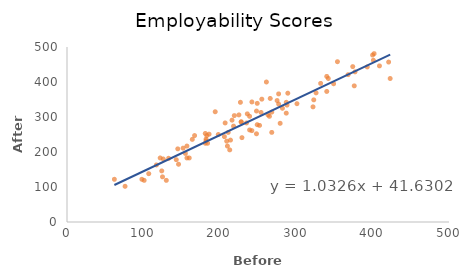
| Category | Employability (After) |
|---|---|
| 252.0 | 276 |
| 423.0 | 410 |
| 101.0 | 119 |
| 288.0 | 334 |
| 248.0 | 252 |
| 145.0 | 209 |
| 401.0 | 462 |
| 287.0 | 342 |
| 275.0 | 347 |
| 254.0 | 313 |
| 182.0 | 232 |
| 117.0 | 163 |
| 130.0 | 119 |
| 219.0 | 304 |
| 152.0 | 211 |
| 228.0 | 286 |
| 62.0 | 122 |
| 393.0 | 443 |
| 277.0 | 366 |
| 206.0 | 244 |
| 229.0 | 241 |
| 182.0 | 237 |
| 98.0 | 122 |
| 125.0 | 129 |
| 164.0 | 236 |
| 186.0 | 251 |
| 235.0 | 283 |
| 184.0 | 225 |
| 76.0 | 102 |
| 126.0 | 180 |
| 183.0 | 247 |
| 242.0 | 343 |
| 207.0 | 283 |
| 181.0 | 253 |
| 239.0 | 263 |
| 216.0 | 291 |
| 289.0 | 368 |
| 213.0 | 206 |
| 209.0 | 231 |
| 376.0 | 389 |
| 332.0 | 396 |
| 249.0 | 339 |
| 228.0 | 286 |
| 124.0 | 146 |
| 194.0 | 315 |
| 157.0 | 183 |
| 402.0 | 481 |
| 323.0 | 349 |
| 181.0 | 225 |
| 157.0 | 217 |
| 266.0 | 353 |
| 268.0 | 314 |
| 167.0 | 247 |
| 342.0 | 410 |
| 349.0 | 395 |
| 340.0 | 416 |
| 227.0 | 342 |
| 409.0 | 446 |
| 400.0 | 477 |
| 374.0 | 444 |
| 255.0 | 351 |
| 146.0 | 165 |
| 248.0 | 317 |
| 198.0 | 250 |
| 210.0 | 217 |
| 107.0 | 138 |
| 239.0 | 302 |
| 287.0 | 311 |
| 340.0 | 373 |
| 155.0 | 196 |
| 263.0 | 306 |
| 265.0 | 302 |
| 249.0 | 278 |
| 377.0 | 429 |
| 301.0 | 338 |
| 242.0 | 261 |
| 211.0 | 256 |
| 160.0 | 183 |
| 218.0 | 274 |
| 133.0 | 182 |
| 122.0 | 183 |
| 236.0 | 309 |
| 143.0 | 178 |
| 354.0 | 458 |
| 214.0 | 234 |
| 225.0 | 306 |
| 261.0 | 400 |
| 277.0 | 337 |
| 282.0 | 325 |
| 322.0 | 329 |
| 326.0 | 369 |
| 421.0 | 457 |
| 368.0 | 421 |
| 279.0 | 282 |
| 268.0 | 256 |